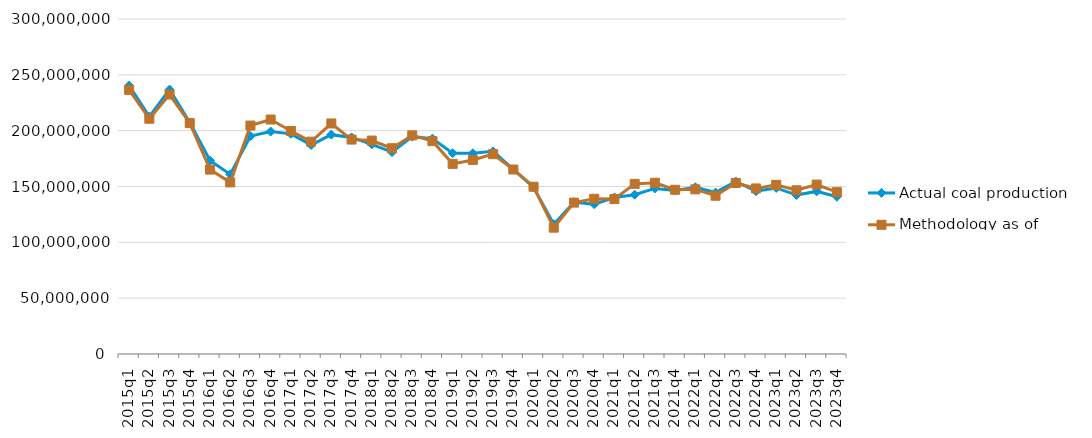
| Category | Actual coal production | Methodology as of 1/8/15 |
|---|---|---|
| 2015q1 | 240323786 | 236521082 |
| 2015q2 | 212556552 | 210661950 |
| 2015q3 | 236823379 | 232358671 |
| 2015q4 | 207236846 | 206788359 |
| 2016q1 | 173225109 | 165133438 |
| 2016q2 | 160852773 | 153680849 |
| 2016q3 | 195100529 | 204574795 |
| 2016q4 | 199186087 | 209978522 |
| 2017q1 | 197138465 | 199709091 |
| 2017q2 | 187098124 | 190183375 |
| 2017q3 | 196440162 | 206458629 |
| 2017q4 | 193932606 | 192026005 |
| 2018q1 | 187743484 | 191096936 |
| 2018q2 | 180829461 | 184275295 |
| 2018q3 | 194731199 | 195799105 |
| 2018q4 | 192862951 | 190618147 |
| 2019q1 | 179817406 | 170275697 |
| 2019q2 | 179780560 | 173789945 |
| 2019q3 | 181460831 | 178942168 |
| 2019q4 | 165250466 | 165203222 |
| 2020q1 | 149198213 | 149792570 |
| 2020q2 | 116217884 | 113134877 |
| 2020q3 | 135881401 | 135573943 |
| 2020q4 | 134136856 | 138994664 |
| 2021q1 | 140130319 | 138749017 |
| 2021q2 | 142674376 | 152326555 |
| 2021q3 | 148271516 | 153335196 |
| 2021q4 | 146355067 | 147083807 |
| 2022q1 | 149310470 | 147438468 |
| 2022q2 | 144610064 | 141743475 |
| 2022q3 | 154476713 | 153164095 |
| 2022q4 | 145758035 | 148256478 |
| 2023q1 | 148706250 | 151464255 |
| 2023q2 | 142337730 | 146602204 |
| 2023q3 | 145605008 | 151722351 |
| 2023q4 | 140835640 | 144964869 |